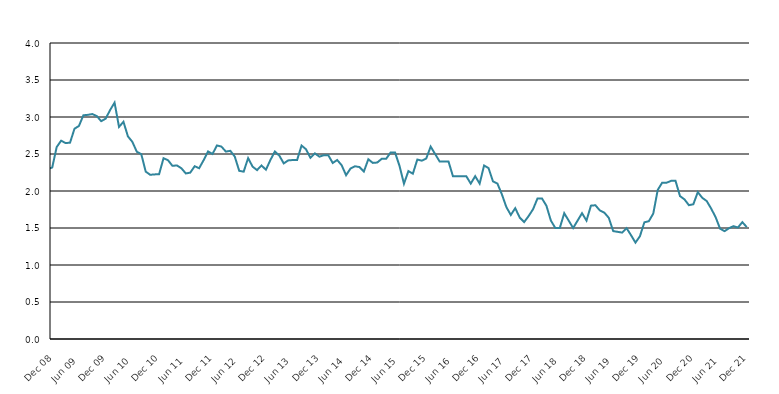
| Category | Series 1 |
|---|---|
| 2006-01-01 | 3.5 |
| 2006-02-01 | 3.4 |
| 2006-03-01 | 3.5 |
| 2006-04-01 | 3.4 |
| 2006-05-01 | 3.2 |
| 2006-06-01 | 3 |
| 2006-07-01 | 3 |
| 2006-08-01 | 3.2 |
| 2006-09-01 | 3.1 |
| 2006-10-01 | 3.1 |
| 2006-11-01 | 3 |
| 2006-12-01 | 3.3 |
| 2007-01-01 | 3.4 |
| 2007-02-01 | 3.3 |
| 2007-03-01 | 3.1 |
| 2007-04-01 | 2.8 |
| 2007-05-01 | 2.6 |
| 2007-06-01 | 2.7 |
| 2007-07-01 | 2.8 |
| 2007-08-01 | 2.9 |
| 2007-09-01 | 2.8 |
| 2007-10-01 | 2.7 |
| 2007-11-01 | 2.7 |
| 2007-12-01 | 2.7 |
| 2008-01-01 | 2.59 |
| 2008-02-01 | 2.48 |
| 2008-03-01 | 2.513 |
| 2008-04-01 | 2.397 |
| 2008-05-01 | 2.075 |
| 2008-06-01 | 2.136 |
| 2008-07-01 | 2.225 |
| 2008-08-01 | 2.259 |
| 2008-09-01 | 2.125 |
| 2008-10-01 | 2.181 |
| 2008-11-01 | 2.297 |
| 2008-12-01 | 2.318 |
| 2009-01-01 | 2.594 |
| 2009-02-01 | 2.68 |
| 2009-03-01 | 2.648 |
| 2009-04-01 | 2.653 |
| 2009-05-01 | 2.842 |
| 2009-06-01 | 2.879 |
| 2009-07-01 | 3.024 |
| 2009-08-01 | 3.029 |
| 2009-09-01 | 3.04 |
| 2009-10-01 | 3.013 |
| 2009-11-01 | 2.943 |
| 2009-12-01 | 2.978 |
| 2010-01-01 | 3.094 |
| 2010-02-01 | 3.195 |
| 2010-03-01 | 2.866 |
| 2010-04-01 | 2.935 |
| 2010-05-01 | 2.739 |
| 2010-06-01 | 2.664 |
| 2010-07-01 | 2.53 |
| 2010-08-01 | 2.498 |
| 2010-09-01 | 2.262 |
| 2010-10-01 | 2.219 |
| 2010-11-01 | 2.224 |
| 2010-12-01 | 2.226 |
| 2011-01-01 | 2.443 |
| 2011-02-01 | 2.416 |
| 2011-03-01 | 2.34 |
| 2011-04-01 | 2.346 |
| 2011-05-01 | 2.308 |
| 2011-06-01 | 2.237 |
| 2011-07-01 | 2.248 |
| 2011-08-01 | 2.335 |
| 2011-09-01 | 2.308 |
| 2011-10-01 | 2.416 |
| 2011-11-01 | 2.535 |
| 2011-12-01 | 2.5 |
| 2012-01-01 | 2.616 |
| 2012-02-01 | 2.6 |
| 2012-03-01 | 2.533 |
| 2012-04-01 | 2.543 |
| 2012-05-01 | 2.465 |
| 2012-06-01 | 2.272 |
| 2012-07-01 | 2.262 |
| 2012-08-01 | 2.444 |
| 2012-09-01 | 2.33 |
| 2012-10-01 | 2.283 |
| 2012-11-01 | 2.345 |
| 2012-12-01 | 2.287 |
| 2013-01-01 | 2.418 |
| 2013-02-01 | 2.534 |
| 2013-03-01 | 2.479 |
| 2013-04-01 | 2.373 |
| 2013-05-01 | 2.413 |
| 2013-06-01 | 2.418 |
| 2013-07-01 | 2.418 |
| 2013-08-01 | 2.614 |
| 2013-09-01 | 2.564 |
| 2013-10-01 | 2.449 |
| 2013-11-01 | 2.509 |
| 2013-12-01 | 2.464 |
| 2014-01-01 | 2.484 |
| 2014-02-01 | 2.484 |
| 2014-03-01 | 2.379 |
| 2014-04-01 | 2.419 |
| 2014-05-01 | 2.349 |
| 2014-06-01 | 2.213 |
| 2014-07-01 | 2.304 |
| 2014-08-01 | 2.334 |
| 2014-09-01 | 2.324 |
| 2014-10-01 | 2.264 |
| 2014-11-01 | 2.429 |
| 2014-12-01 | 2.38 |
| 2015-01-01 | 2.385 |
| 2015-02-01 | 2.435 |
| 2015-03-01 | 2.435 |
| 2015-04-01 | 2.52 |
| 2015-05-01 | 2.52 |
| 2015-06-01 | 2.339 |
| 2015-07-01 | 2.098 |
| 2015-08-01 | 2.269 |
| 2015-09-01 | 2.234 |
| 2015-10-01 | 2.425 |
| 2015-11-01 | 2.41 |
| 2015-12-01 | 2.438 |
| 2016-01-01 | 2.6 |
| 2016-02-01 | 2.5 |
| 2016-03-01 | 2.4 |
| 2016-04-01 | 2.4 |
| 2016-05-01 | 2.4 |
| 2016-06-01 | 2.2 |
| 2016-07-01 | 2.2 |
| 2016-08-01 | 2.2 |
| 2016-09-01 | 2.2 |
| 2016-10-01 | 2.1 |
| 2016-11-01 | 2.2 |
| 2016-12-01 | 2.1 |
| 2017-01-01 | 2.344 |
| 2017-02-01 | 2.31 |
| 2017-03-01 | 2.13 |
| 2017-04-01 | 2.099 |
| 2017-05-01 | 1.954 |
| 2017-06-01 | 1.783 |
| 2017-07-01 | 1.677 |
| 2017-08-01 | 1.767 |
| 2017-09-01 | 1.641 |
| 2017-10-01 | 1.58 |
| 2017-11-01 | 1.661 |
| 2017-12-01 | 1.754 |
| 2018-01-01 | 1.9 |
| 2018-02-01 | 1.9 |
| 2018-03-01 | 1.8 |
| 2018-04-01 | 1.6 |
| 2018-05-01 | 1.5 |
| 2018-06-01 | 1.5 |
| 2018-07-01 | 1.7 |
| 2018-08-01 | 1.6 |
| 2018-09-01 | 1.5 |
| 2018-10-01 | 1.6 |
| 2018-11-01 | 1.7 |
| 2018-12-01 | 1.6 |
| 2019-01-01 | 1.802 |
| 2019-02-01 | 1.807 |
| 2019-03-01 | 1.738 |
| 2019-04-01 | 1.708 |
| 2019-05-01 | 1.638 |
| 2019-06-01 | 1.458 |
| 2019-07-01 | 1.448 |
| 2019-08-01 | 1.438 |
| 2019-09-01 | 1.498 |
| 2019-10-01 | 1.403 |
| 2019-11-01 | 1.303 |
| 2019-12-01 | 1.389 |
| 2020-01-01 | 1.577 |
| 2020-02-01 | 1.592 |
| 2020-03-01 | 1.695 |
| 2020-04-01 | 2.015 |
| 2020-05-01 | 2.112 |
| 2020-06-01 | 2.112 |
| 2020-07-01 | 2.137 |
| 2020-08-01 | 2.137 |
| 2020-09-01 | 1.931 |
| 2020-10-01 | 1.887 |
| 2020-11-01 | 1.808 |
| 2020-12-01 | 1.821 |
| 2021-01-01 | 1.985 |
| 2021-02-01 | 1.908 |
| 2021-03-01 | 1.864 |
| 2021-04-01 | 1.763 |
| 2021-05-01 | 1.647 |
| 2021-06-01 | 1.491 |
| 2021-07-01 | 1.457 |
| 2021-08-01 | 1.496 |
| 2021-09-01 | 1.525 |
| 2021-10-01 | 1.506 |
| 2021-11-01 | 1.579 |
| 2021-12-01 | 1.512 |